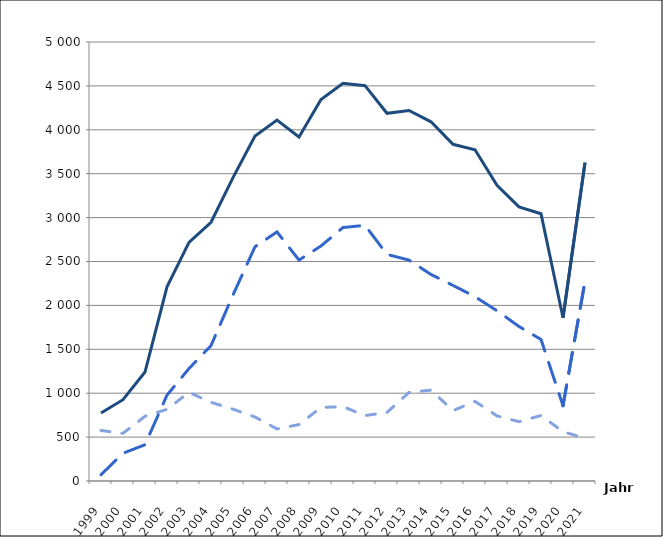
| Category | Series 0 | Series 1 | Series 2 |
|---|---|---|---|
| 1999.0 | 775 | 575 | 71 |
| 2000.0 | 926 | 543 | 316 |
| 2001.0 | 1241 | 737 | 413 |
| 2002.0 | 2211 | 816 | 978 |
| 2003.0 | 2717 | 1010 | 1281 |
| 2004.0 | 2947 | 896 | 1542 |
| 2005.0 | 3455 | 818 | 2119 |
| 2006.0 | 3929 | 729 | 2668 |
| 2007.0 | 4110 | 593 | 2837 |
| 2008.0 | 3919 | 643 | 2516 |
| 2009.0 | 4346 | 838 | 2677 |
| 2010.0 | 4530 | 847 | 2887 |
| 2011.0 | 4503 | 745 | 2912 |
| 2012.0 | 4188 | 781 | 2581 |
| 2013.0 | 4220 | 1009 | 2516 |
| 2014.0 | 4091 | 1035 | 2352 |
| 2015.0 | 3835 | 802 | 2228 |
| 2016.0 | 3772 | 907 | 2099 |
| 2017.0 | 3367 | 741 | 1939 |
| 2018.0 | 3122 | 676 | 1760 |
| 2019.0 | 3044 | 746 | 1612 |
| 2020.0 | 1859 | 561 | 858 |
| 2021.0 | 3626 | 488 | 2276 |